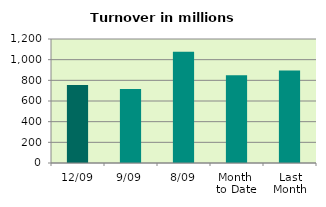
| Category | Series 0 |
|---|---|
| 12/09 | 755.482 |
| 9/09 | 715.528 |
| 8/09 | 1076.016 |
| Month 
to Date | 848.836 |
| Last
Month | 893.956 |